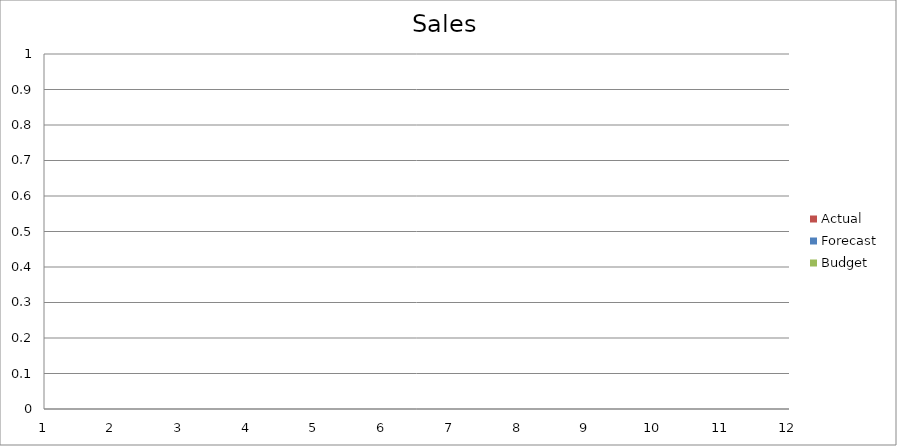
| Category | Budget | Forecast | Actual |
|---|---|---|---|
| 0 | 3070 | 2470 | 1910 |
| 1 | 500 | 3180 | 2740 |
| 2 | 1890 | 1020 | 1770 |
| 3 | 2740 | 1800 | 1040 |
| 4 | 3280 | 620 | 530 |
| 5 | 1670 | 2240 | 690 |
| 6 | 2190 | 2970 | 2690 |
| 7 | 3300 | 800 | 3300 |
| 8 | 1290 | 1130 | 2760 |
| 9 | 2990 | 580 | 2860 |
| 10 | 1520 | 1770 | 1500 |
| 11 | 1430 | 580 | 1630 |